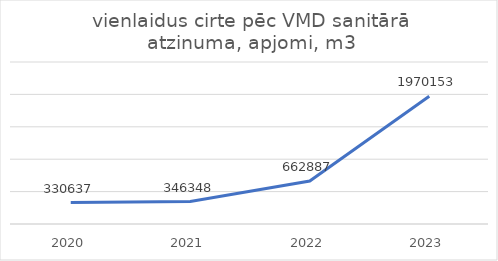
| Category | vienlaidus cirte pēc VMD sanitārā atzinuma, apjomi, m3 |
|---|---|
| 2020.0 | 330637 |
| 2021.0 | 346348 |
| 2022.0 | 662887 |
| 2023.0 | 1970153 |